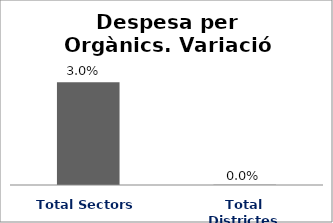
| Category | Series 0 |
|---|---|
| Total Sectors | 0.03 |
| Total Districtes | 0 |